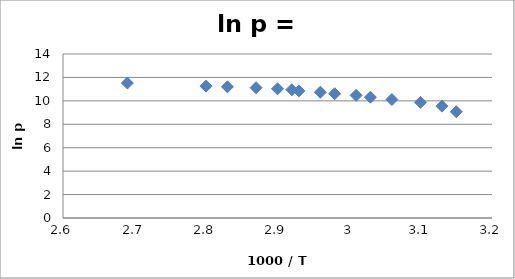
| Category | Series 0 |
|---|---|
| 3.15 | 9.07 |
| 3.13 | 9.55 |
| 3.1 | 9.87 |
| 3.06 | 10.11 |
| 3.03 | 10.31 |
| 3.01 | 10.47 |
| 2.98 | 10.61 |
| 2.96 | 10.74 |
| 2.93 | 10.85 |
| 2.92 | 10.95 |
| 2.9 | 11.03 |
| 2.87 | 11.12 |
| 2.83 | 11.2 |
| 2.8 | 11.26 |
| 2.69 | 11.52 |